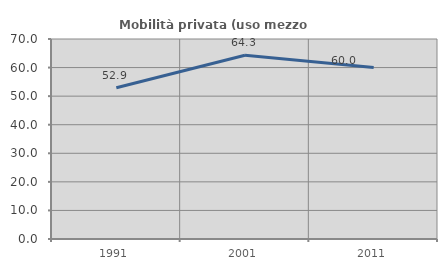
| Category | Mobilità privata (uso mezzo privato) |
|---|---|
| 1991.0 | 52.941 |
| 2001.0 | 64.286 |
| 2011.0 | 60 |